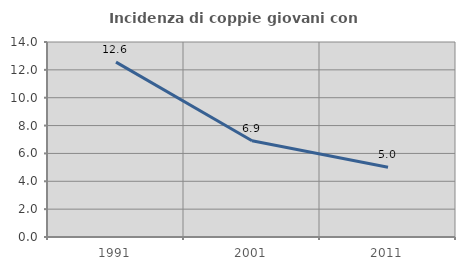
| Category | Incidenza di coppie giovani con figli |
|---|---|
| 1991.0 | 12.556 |
| 2001.0 | 6.911 |
| 2011.0 | 5.011 |